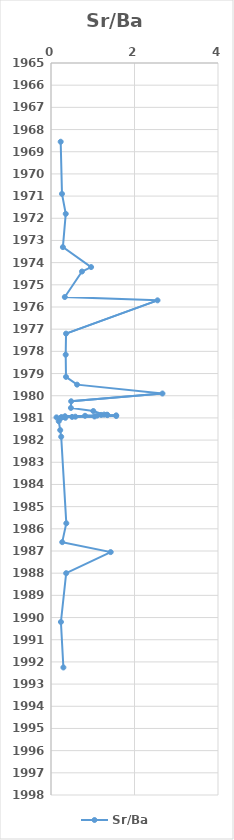
| Category | Sr/Ba |
|---|---|
| 0.2320057940727725 | 1968.55 |
| 0.2631782947431579 | 1970.9 |
| 0.35312606408010533 | 1971.8 |
| 0.2848283372154003 | 1973.3 |
| 0.9607725456162163 | 1974.2 |
| 0.742148984455048 | 1974.4 |
| 0.3308614479009391 | 1975.55 |
| 2.5514919484840437 | 1975.7 |
| 0.3600587258830289 | 1977.2 |
| 0.35203760488174757 | 1978.15 |
| 0.35918338748651546 | 1979.15 |
| 0.6240570691638254 | 1979.5 |
| 2.669885613720503 | 1979.9 |
| 0.4826804240648084 | 1980.25 |
| 0.4767973874930565 | 1980.55 |
| 1.0129174757903856 | 1980.69 |
| 1.2729328884361548 | 1980.85 |
| 1.3437508360247006 | 1980.855 |
| 1.2021973848444403 | 1980.865 |
| 1.3501554655782262 | 1980.875 |
| 1.5616207923609124 | 1980.885 |
| 1.1054634928149307 | 1980.895 |
| 0.8151486417750581 | 1980.905 |
| 1.5620620040170416 | 1980.915 |
| 0.3353326457284848 | 1980.925 |
| 1.0412902494894225 | 1980.935 |
| 0.5847421807037925 | 1980.945 |
| 0.5043967363627091 | 1980.955 |
| 0.25525920139463215 | 1980.965 |
| 0.1317437826896718 | 1980.975 |
| 0.23724677916025164 | 1980.985 |
| 0.34476922931361786 | 1980.995 |
| 0.18594654092788926 | 1981.15 |
| 0.2208225388102114 | 1981.55 |
| 0.2443439655126216 | 1981.85 |
| 0.3666144630970257 | 1985.75 |
| 0.26910107482707396 | 1986.6 |
| 1.4296330430354671 | 1987.05 |
| 0.36341578159013493 | 1988 |
| 0.237589916493348 | 1990.2 |
| 0.29681391622067854 | 1992.25 |